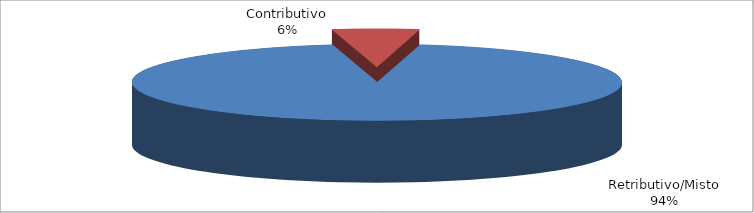
| Category | Series 1 |
|---|---|
| Retributivo/Misto | 59384 |
| Contributivo | 3586 |